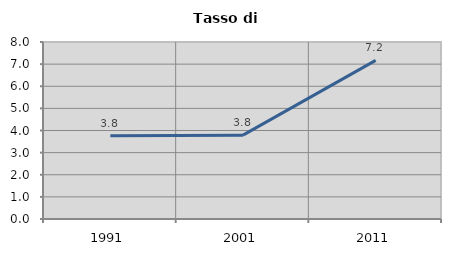
| Category | Tasso di disoccupazione   |
|---|---|
| 1991.0 | 3.765 |
| 2001.0 | 3.79 |
| 2011.0 | 7.169 |